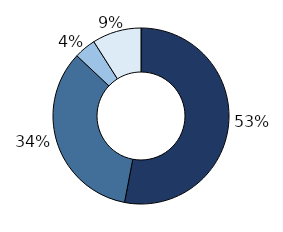
| Category | Series 0 |
|---|---|
| Single no child dependant(s) | 0.53 |
| Single with child dependant(s) | 0.34 |
| Couple no child dependant(s) | 0.04 |
| Couple with child dependant(s) | 0.09 |